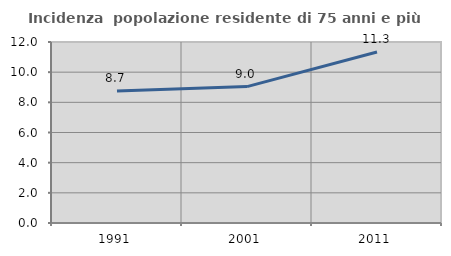
| Category | Incidenza  popolazione residente di 75 anni e più |
|---|---|
| 1991.0 | 8.745 |
| 2001.0 | 9.043 |
| 2011.0 | 11.341 |